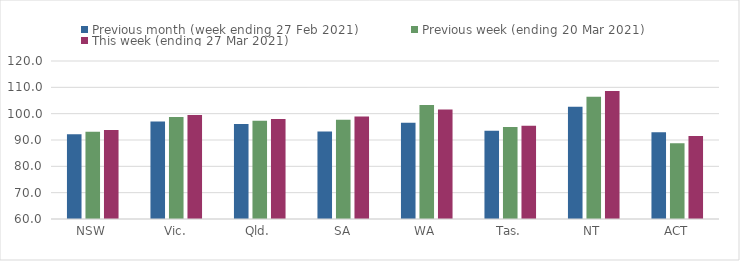
| Category | Previous month (week ending 27 Feb 2021) | Previous week (ending 20 Mar 2021) | This week (ending 27 Mar 2021) |
|---|---|---|---|
| NSW | 92.17 | 93.18 | 93.76 |
| Vic. | 97 | 98.75 | 99.47 |
| Qld. | 96.12 | 97.32 | 98 |
| SA | 93.21 | 97.65 | 98.93 |
| WA | 96.56 | 103.3 | 101.59 |
| Tas. | 93.52 | 94.9 | 95.43 |
| NT | 102.67 | 106.45 | 108.64 |
| ACT | 92.99 | 88.73 | 91.54 |